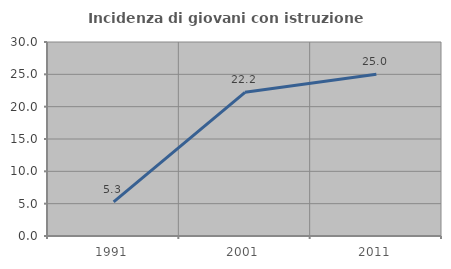
| Category | Incidenza di giovani con istruzione universitaria |
|---|---|
| 1991.0 | 5.263 |
| 2001.0 | 22.222 |
| 2011.0 | 25 |